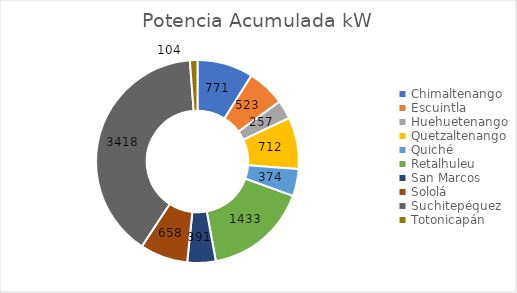
| Category | Potencia Acumulada kW |
|---|---|
| Chimaltenango | 771 |
| Escuintla | 523 |
| Huehuetenango | 257 |
| Quetzaltenango | 712 |
| Quiché | 374 |
| Retalhuleu | 1433 |
| San Marcos | 391 |
| Sololá | 658 |
| Suchitepéquez | 3418 |
| Totonicapán | 104 |